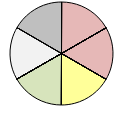
| Category | Series 1 |
|---|---|
| + + | 0 |
| + | 0 |
| o | 0 |
| - | 1 |
| - - | 0 |
| + + | 0 |
| + | 0 |
| o | 0 |
| - | 1 |
| - - | 0 |
| + + | 0 |
| + | 0 |
| o | 1 |
| - | 0 |
| - - | 0 |
| + + | 0 |
| + | 1 |
| o | 0 |
| - | 0 |
| - - | 0 |
| * * | 0 |
| * | 0 |
| o | 1 |
| * * | 0 |
| * | 1 |
| o | 0 |